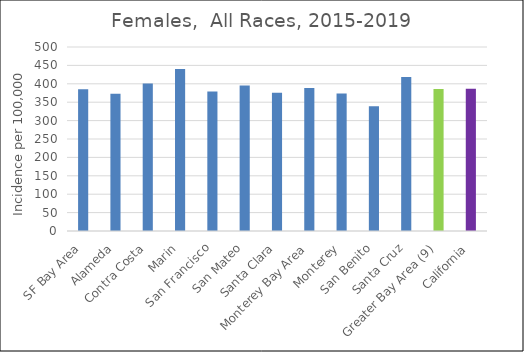
| Category | Female |
|---|---|
| SF Bay Area | 385.41 |
|   Alameda | 372.83 |
|   Contra Costa | 401.01 |
|   Marin | 439.99 |
|   San Francisco | 379.25 |
|   San Mateo | 395.36 |
|   Santa Clara | 375.86 |
| Monterey Bay Area | 388.25 |
|   Monterey | 373.42 |
|   San Benito | 339.12 |
|   Santa Cruz | 418.44 |
| Greater Bay Area (9) | 385.65 |
| California | 386.61 |